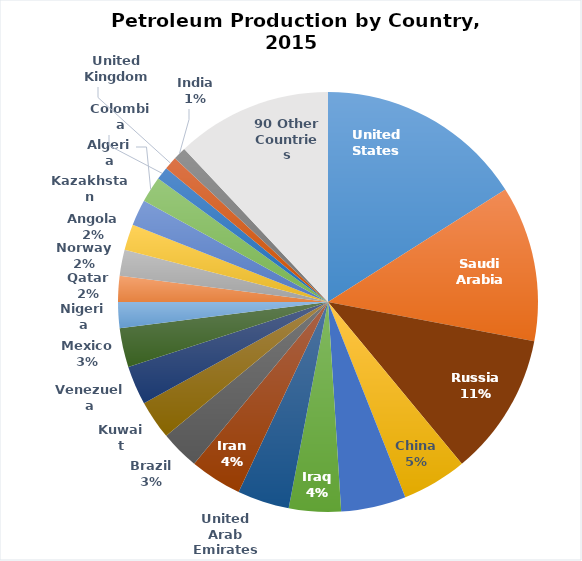
| Category | Series 0 |
|---|---|
| United States | 0.16 |
| Saudi Arabia | 0.12 |
| Russia | 0.11 |
| China | 0.05 |
| Canada | 0.05 |
| Iraq | 0.04 |
| United Arab Emirates | 0.04 |
| Iran | 0.04 |
| Brazil | 0.03 |
| Kuwait | 0.03 |
| Venezuela | 0.03 |
| Mexico | 0.03 |
| Nigeria | 0.02 |
| Qatar | 0.02 |
| Norway | 0.02 |
| Angola | 0.02 |
| Kazakhstan | 0.02 |
| Algeria | 0.02 |
| Colombia | 0.01 |
| United Kingdom | 0.01 |
| India | 0.01 |
| 90 Other Countries | 0.12 |